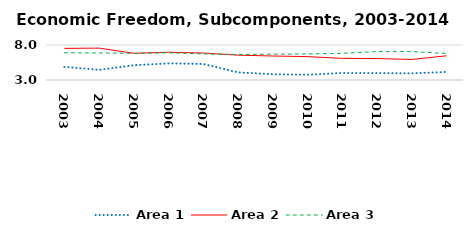
| Category | Area 1 | Area 2 | Area 3 |
|---|---|---|---|
| 2003.0 | 4.884 | 7.517 | 6.891 |
| 2004.0 | 4.447 | 7.555 | 6.862 |
| 2005.0 | 5.111 | 6.816 | 6.812 |
| 2006.0 | 5.373 | 6.961 | 6.896 |
| 2007.0 | 5.285 | 6.859 | 6.73 |
| 2008.0 | 4.086 | 6.547 | 6.648 |
| 2009.0 | 3.823 | 6.426 | 6.693 |
| 2010.0 | 3.754 | 6.341 | 6.729 |
| 2011.0 | 4 | 6.087 | 6.812 |
| 2012.0 | 3.986 | 6.067 | 7.063 |
| 2013.0 | 3.948 | 5.931 | 7.048 |
| 2014.0 | 4.158 | 6.46 | 6.791 |